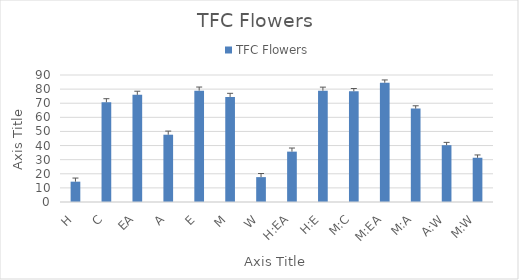
| Category | TFC Flowers  |
|---|---|
| H | 14.405 |
| C | 70.649 |
| EA | 75.938 |
| A | 47.687 |
| E | 78.905 |
| M | 74.454 |
| W | 17.63 |
| H:EA | 35.69 |
| H:E | 78.84 |
| M:C | 78.437 |
| M:EA | 84.5 |
| M:A | 66.182 |
| A:W | 40.253 |
| M:W | 31.352 |